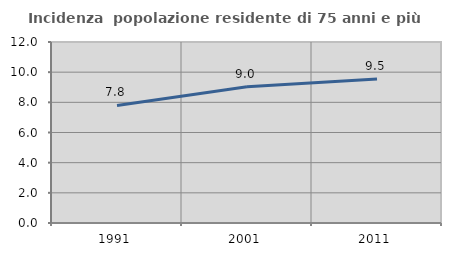
| Category | Incidenza  popolazione residente di 75 anni e più |
|---|---|
| 1991.0 | 7.795 |
| 2001.0 | 9.035 |
| 2011.0 | 9.543 |